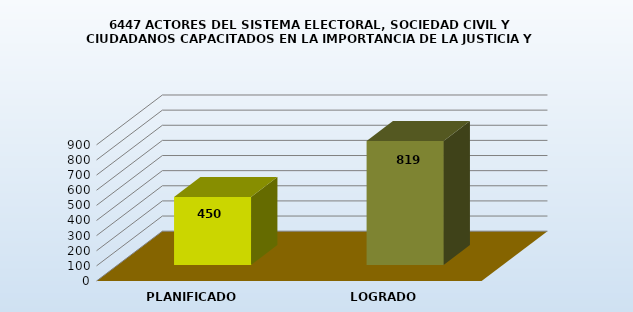
| Category | 6447 |
|---|---|
| PLANIFICADO | 450 |
| LOGRADO | 819 |